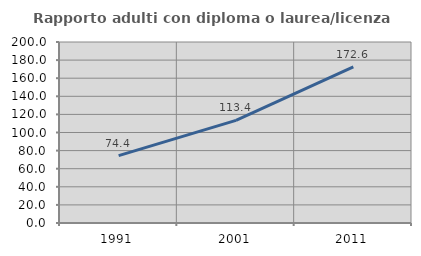
| Category | Rapporto adulti con diploma o laurea/licenza media  |
|---|---|
| 1991.0 | 74.396 |
| 2001.0 | 113.419 |
| 2011.0 | 172.591 |